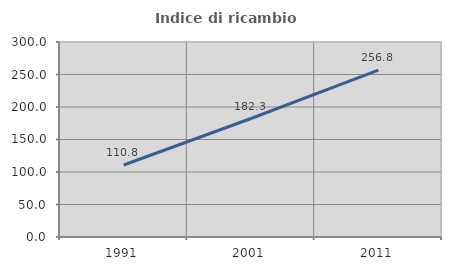
| Category | Indice di ricambio occupazionale  |
|---|---|
| 1991.0 | 110.769 |
| 2001.0 | 182.292 |
| 2011.0 | 256.79 |